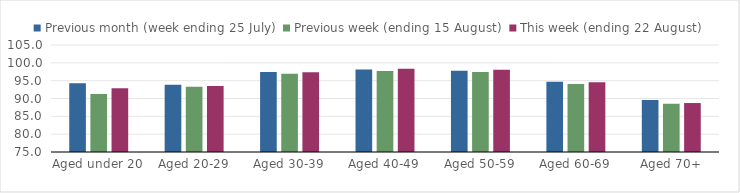
| Category | Previous month (week ending 25 July) | Previous week (ending 15 August) | This week (ending 22 August) |
|---|---|---|---|
| Aged under 20 | 94.26 | 91.251 | 92.845 |
| Aged 20-29 | 93.853 | 93.301 | 93.506 |
| Aged 30-39 | 97.398 | 96.926 | 97.34 |
| Aged 40-49 | 98.124 | 97.692 | 98.327 |
| Aged 50-59 | 97.814 | 97.405 | 98.042 |
| Aged 60-69 | 94.724 | 94.093 | 94.589 |
| Aged 70+ | 89.557 | 88.527 | 88.727 |